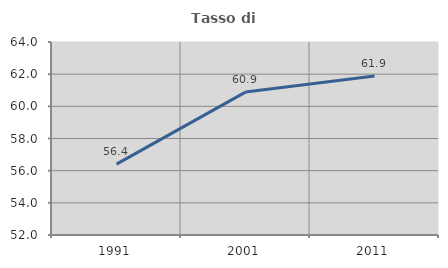
| Category | Tasso di occupazione   |
|---|---|
| 1991.0 | 56.41 |
| 2001.0 | 60.887 |
| 2011.0 | 61.88 |